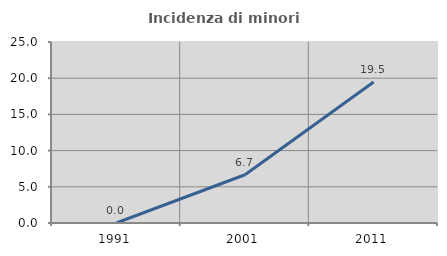
| Category | Incidenza di minori stranieri |
|---|---|
| 1991.0 | 0 |
| 2001.0 | 6.667 |
| 2011.0 | 19.481 |